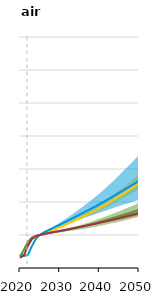
| Category | Reference |
|---|---|
| 2020.0 | 0.308 |
| 2021.0 | 0.386 |
| 2022.0 | 0.678 |
| 2023.0 | 0.881 |
| 2024.0 | 0.97 |
| 2025.0 | 1 |
| 2026.0 | 1.028 |
| 2027.0 | 1.053 |
| 2028.0 | 1.077 |
| 2029.0 | 1.099 |
| 2030.0 | 1.122 |
| 2031.0 | 1.144 |
| 2032.0 | 1.168 |
| 2033.0 | 1.191 |
| 2034.0 | 1.216 |
| 2035.0 | 1.24 |
| 2036.0 | 1.265 |
| 2037.0 | 1.291 |
| 2038.0 | 1.317 |
| 2039.0 | 1.343 |
| 2040.0 | 1.37 |
| 2041.0 | 1.397 |
| 2042.0 | 1.425 |
| 2043.0 | 1.454 |
| 2044.0 | 1.482 |
| 2045.0 | 1.511 |
| 2046.0 | 1.541 |
| 2047.0 | 1.571 |
| 2048.0 | 1.602 |
| 2049.0 | 1.632 |
| 2050.0 | 1.664 |